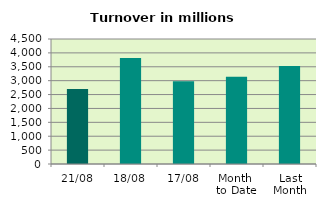
| Category | Series 0 |
|---|---|
| 21/08 | 2701.396 |
| 18/08 | 3813.046 |
| 17/08 | 2981.324 |
| Month 
to Date | 3141.006 |
| Last
Month | 3531.02 |